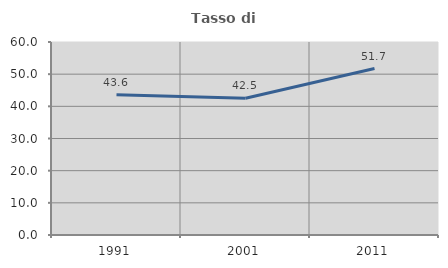
| Category | Tasso di occupazione   |
|---|---|
| 1991.0 | 43.573 |
| 2001.0 | 42.505 |
| 2011.0 | 51.737 |